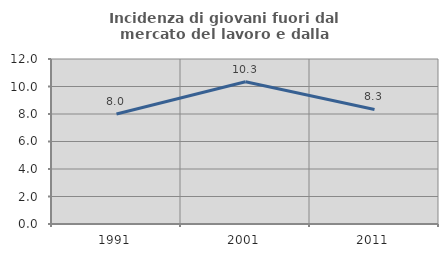
| Category | Incidenza di giovani fuori dal mercato del lavoro e dalla formazione  |
|---|---|
| 1991.0 | 8 |
| 2001.0 | 10.345 |
| 2011.0 | 8.333 |